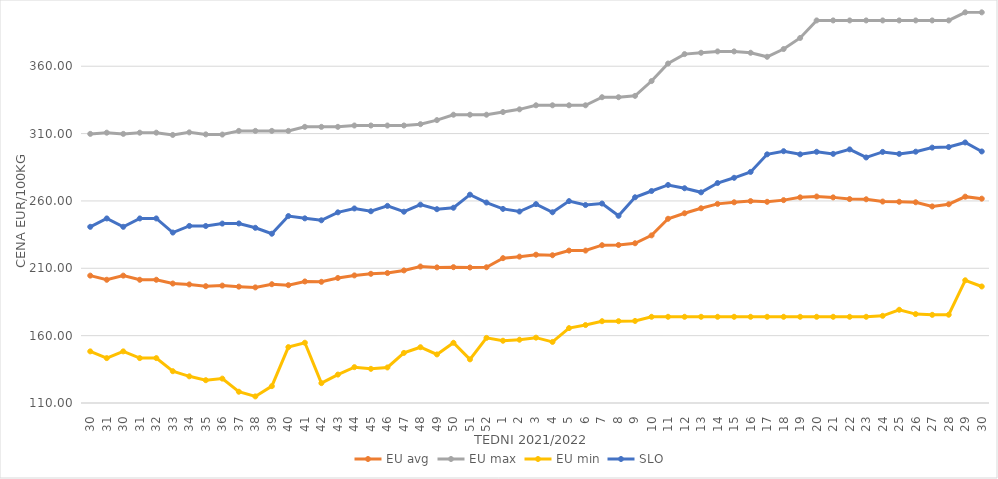
| Category | EU avg | EU max | EU min | SLO |
|---|---|---|---|---|
| 30.0 | 204.558 | 309.78 | 148.33 | 240.79 |
| 31.0 | 201.483 | 310.67 | 143.33 | 247 |
| 30.0 | 204.558 | 309.78 | 148.33 | 240.79 |
| 31.0 | 201.483 | 310.67 | 143.33 | 247 |
| 32.0 | 201.483 | 310.67 | 143.33 | 247 |
| 33.0 | 198.691 | 309 | 133.607 | 236.54 |
| 34.0 | 198.027 | 310.9 | 129.797 | 241.45 |
| 35.0 | 196.72 | 309.41 | 126.926 | 241.39 |
| 36.0 | 197.157 | 309.28 | 128.099 | 243.19 |
| 37.0 | 196.375 | 312 | 118.364 | 243.28 |
| 38.0 | 195.821 | 312 | 114.892 | 240.06 |
| 39.0 | 198.179 | 312 | 122.517 | 235.66 |
| 40.0 | 197.482 | 312 | 151.488 | 248.77 |
| 41.0 | 200.22 | 315 | 154.74 | 247.07 |
| 42.0 | 199.965 | 315 | 124.748 | 245.64 |
| 43.0 | 202.804 | 315 | 131.104 | 251.53 |
| 44.0 | 204.713 | 316 | 136.6 | 254.42 |
| 45.0 | 205.906 | 316 | 135.362 | 252.35 |
| 46.0 | 206.476 | 316 | 136.39 | 256.33 |
| 47.0 | 208.415 | 316 | 147.192 | 252.01 |
| 48.0 | 211.314 | 317 | 151.41 | 257.25 |
| 49.0 | 210.677 | 320 | 146.064 | 253.87 |
| 50.0 | 210.823 | 324 | 154.698 | 254.94 |
| 51.0 | 210.59 | 324 | 142.382 | 264.65 |
| 52.0 | 210.763 | 324 | 158.333 | 258.8 |
| 1.0 | 217.519 | 326 | 156.222 | 254.09 |
| 2.0 | 218.654 | 328 | 156.969 | 252.15 |
| 3.0 | 220.098 | 331 | 158.511 | 257.65 |
| 4.0 | 219.685 | 331 | 155.346 | 251.6 |
| 5.0 | 223.143 | 331 | 165.59 | 259.87 |
| 6.0 | 223.178 | 331 | 167.86 | 256.97 |
| 7.0 | 227.145 | 337 | 170.719 | 258.07 |
| 8.0 | 227.312 | 337 | 170.743 | 248.97 |
| 9.0 | 228.588 | 338 | 170.92 | 262.72 |
| 10.0 | 234.434 | 349 | 174 | 267.38 |
| 11.0 | 246.762 | 362 | 174 | 271.86 |
| 12.0 | 250.845 | 369 | 174 | 269.43 |
| 13.0 | 254.568 | 370 | 174 | 266.39 |
| 14.0 | 257.819 | 371 | 174 | 273.3 |
| 15.0 | 259 | 371 | 174 | 277.18 |
| 16.0 | 259.873 | 370 | 174 | 281.55 |
| 17.0 | 259.351 | 367 | 174 | 294.59 |
| 18.0 | 260.6 | 372.758 | 174 | 296.93 |
| 19.0 | 262.669 | 381 | 174 | 294.6 |
| 20.0 | 263.291 | 394 | 174 | 296.48 |
| 21.0 | 262.64 | 394 | 174 | 294.94 |
| 22.0 | 261.388 | 394 | 174 | 298.26 |
| 23.0 | 261.228 | 394 | 174 | 292.27 |
| 24.0 | 259.544 | 394 | 174.72 | 296.39 |
| 25.0 | 259.395 | 394 | 179.2 | 294.93 |
| 26.0 | 259.018 | 394 | 176 | 296.56 |
| 27.0 | 255.922 | 394 | 175.451 | 299.59 |
| 28.0 | 257.569 | 394 | 175.52 | 300.01 |
| 29.0 | 263.175 | 400 | 201.097 | 303.41 |
| 30.0 | 261.688 | 400 | 196.496 | 296.73 |